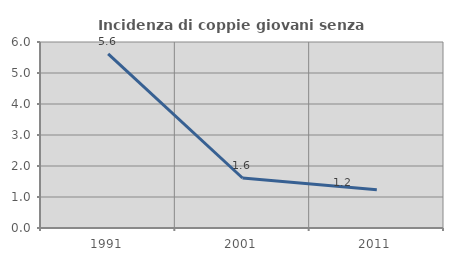
| Category | Incidenza di coppie giovani senza figli |
|---|---|
| 1991.0 | 5.618 |
| 2001.0 | 1.613 |
| 2011.0 | 1.235 |